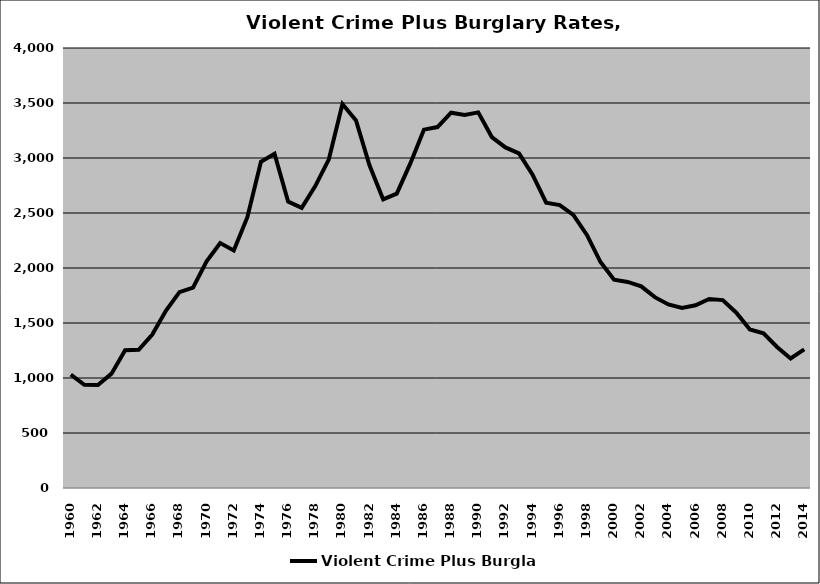
| Category | Violent Crime Plus Burglary |
|---|---|
| 1960.0 | 1030.524 |
| 1961.0 | 938.395 |
| 1962.0 | 935.409 |
| 1963.0 | 1039.526 |
| 1964.0 | 1253.252 |
| 1965.0 | 1256.537 |
| 1966.0 | 1395.523 |
| 1967.0 | 1611.126 |
| 1968.0 | 1780.13 |
| 1969.0 | 1821.199 |
| 1970.0 | 2059.963 |
| 1971.0 | 2226.246 |
| 1972.0 | 2159.636 |
| 1973.0 | 2461.787 |
| 1974.0 | 2964.932 |
| 1975.0 | 3038.148 |
| 1976.0 | 2603.088 |
| 1977.0 | 2546.699 |
| 1978.0 | 2744.391 |
| 1979.0 | 2988.318 |
| 1980.0 | 3490.29 |
| 1981.0 | 3340.99 |
| 1982.0 | 2931.48 |
| 1983.0 | 2623.539 |
| 1984.0 | 2675.984 |
| 1985.0 | 2950.669 |
| 1986.0 | 3257.764 |
| 1987.0 | 3281.327 |
| 1988.0 | 3411.998 |
| 1989.0 | 3392.226 |
| 1990.0 | 3414.937 |
| 1991.0 | 3190.148 |
| 1992.0 | 3095.952 |
| 1993.0 | 3041.436 |
| 1994.0 | 2847.825 |
| 1995.0 | 2593.308 |
| 1996.0 | 2572.264 |
| 1997.0 | 2483.431 |
| 1998.0 | 2300.355 |
| 1999.0 | 2054.245 |
| 2000.0 | 1893.805 |
| 2001.0 | 1873.565 |
| 2002.0 | 1833.025 |
| 2003.0 | 1734.931 |
| 2004.0 | 1668.558 |
| 2005.0 | 1636.295 |
| 2006.0 | 1661.011 |
| 2007.0 | 1718.935 |
| 2008.0 | 1708.299 |
| 2009.0 | 1593.621 |
| 2010.0 | 1441.857 |
| 2011.0 | 1406.379 |
| 2012.0 | 1281.783 |
| 2013.0 | 1178.083 |
| 2014.0 | 1260.43 |